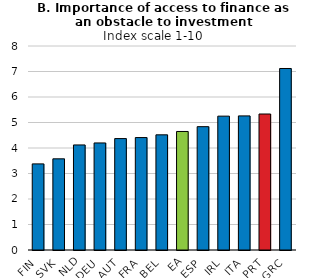
| Category | H1 2016 |
|---|---|
| FIN | 3.377 |
| SVK | 3.575 |
| NLD | 4.12 |
| DEU | 4.198 |
| AUT | 4.369 |
| FRA | 4.409 |
| BEL | 4.516 |
| EA | 4.648 |
| ESP | 4.837 |
| IRL | 5.249 |
| ITA | 5.259 |
| PRT | 5.333 |
| GRC | 7.118 |